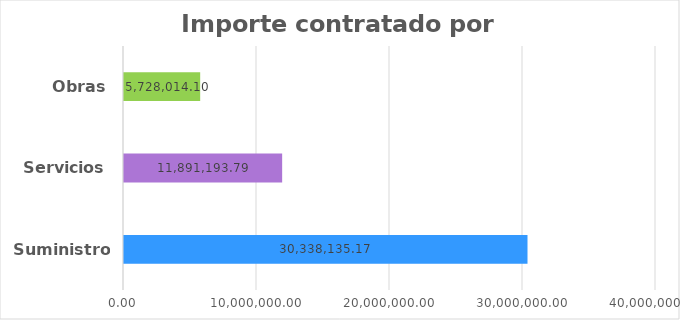
| Category | Series 0 |
|---|---|
| Suministros | 30338135.174 |
| Servicios | 11891193.79 |
| Obras | 5728014.1 |